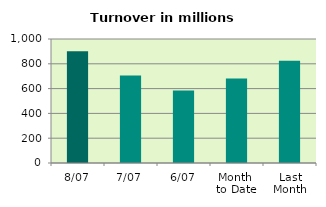
| Category | Series 0 |
|---|---|
| 8/07 | 902.113 |
| 7/07 | 706.421 |
| 6/07 | 584.331 |
| Month 
to Date | 680.563 |
| Last
Month | 824.124 |